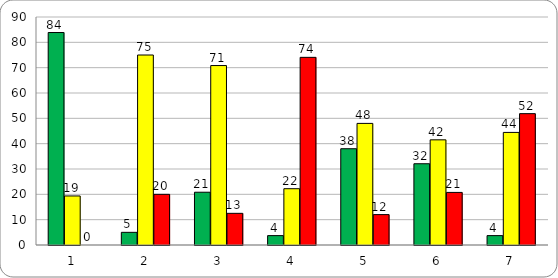
| Category | Series 0 | Series 1 | Series 2 |
|---|---|---|---|
| 0 | 83.871 | 19.355 | 0 |
| 1 | 5 | 75 | 20 |
| 2 | 20.833 | 70.833 | 12.5 |
| 3 | 3.704 | 22.222 | 74.074 |
| 4 | 38 | 48 | 12 |
| 5 | 32.075 | 41.509 | 20.755 |
| 6 | 3.704 | 44.444 | 51.852 |